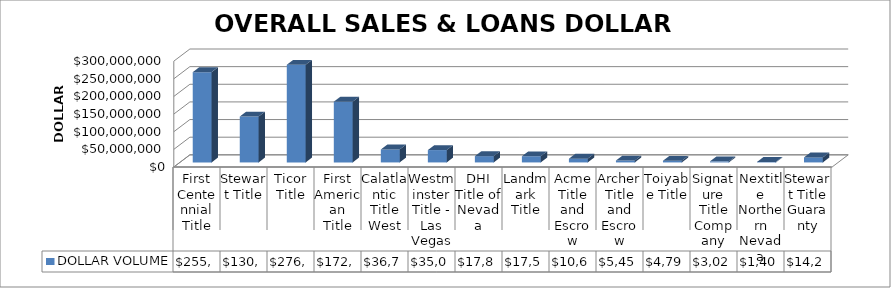
| Category | DOLLAR VOLUME |
|---|---|
| First Centennial Title | 255971544.12 |
| Stewart Title | 130121493 |
| Ticor Title | 276918146.32 |
| First American Title | 172226837.76 |
| Calatlantic Title West | 36705068 |
| Westminster Title - Las Vegas | 35053741 |
| DHI Title of Nevada | 17815363.75 |
| Landmark Title | 17518129 |
| Acme Title and Escrow | 10637858 |
| Archer Title and Escrow | 5450222 |
| Toiyabe Title | 4792800 |
| Signature Title Company | 3026400 |
| Nextitle Northern Nevada | 1404643 |
| Stewart Title Guaranty | 14270000 |